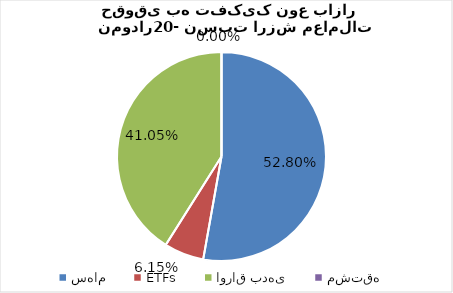
| Category | نسبت ارزش معاملات حقوقی |
|---|---|
| سهام | 0.528 |
| ETFs | 0.061 |
| اوراق بدهی | 0.41 |
| مشتقه | 0 |